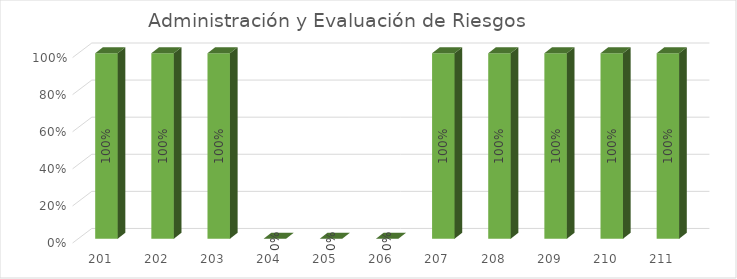
| Category | % Avance |
|---|---|
| 201.0 | 1 |
| 202.0 | 1 |
| 203.0 | 1 |
| 204.0 | 0 |
| 205.0 | 0 |
| 206.0 | 0 |
| 207.0 | 1 |
| 208.0 | 1 |
| 209.0 | 1 |
| 210.0 | 1 |
| 211.0 | 1 |